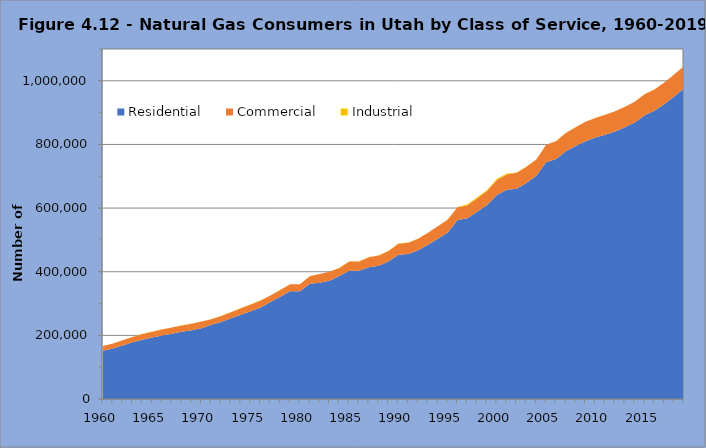
| Category | Residential | Commercial | Industrial |
|---|---|---|---|
| 1960.0 | 151700 | 14500 | 300 |
| 1961.0 | 159000 | 15200 | 400 |
| 1962.0 | 168400 | 16100 | 400 |
| 1963.0 | 178100 | 17000 | 400 |
| 1964.0 | 186600 | 17800 | 400 |
| 1965.0 | 193000 | 18400 | 500 |
| 1966.0 | 199400 | 18900 | 600 |
| 1967.0 | 205000 | 19500 | 600 |
| 1968.0 | 211100 | 20100 | 600 |
| 1969.0 | 216100 | 20600 | 600 |
| 1970.0 | 222000 | 21200 | 600 |
| 1971.0 | 233100 | 17900 | 700 |
| 1972.0 | 242100 | 18600 | 700 |
| 1973.0 | 253400 | 19500 | 700 |
| 1974.0 | 264800 | 20300 | 700 |
| 1975.0 | 275600 | 21200 | 700 |
| 1976.0 | 287200 | 22100 | 700 |
| 1977.0 | 304900 | 20000 | 700 |
| 1978.0 | 321300 | 21000 | 700 |
| 1979.0 | 338300 | 22100 | 600 |
| 1980.0 | 338300 | 22100 | 600 |
| 1981.0 | 362300 | 23600 | 600 |
| 1982.0 | 365600 | 27000 | 500 |
| 1983.0 | 371700 | 28100 | 500 |
| 1984.0 | 386500 | 25200 | 500 |
| 1985.0 | 403300 | 29000 | 600 |
| 1986.0 | 403200 | 29000 | 600 |
| 1987.0 | 414020 | 31329 | 551 |
| 1988.0 | 418569 | 32637 | 627 |
| 1989.0 | 432377 | 32966 | 550 |
| 1990.0 | 453023 | 34697 | 1508 |
| 1991.0 | 455649 | 35627 | 631 |
| 1992.0 | 467664 | 36145 | 783 |
| 1993.0 | 484438 | 37816 | 345 |
| 1994.0 | 503583 | 39183 | 252 |
| 1995.0 | 523622 | 40101 | 713 |
| 1996.0 | 562343 | 40107 | 923 |
| 1997.0 | 567786 | 40689 | 3379 |
| 1998.0 | 588364 | 42054 | 3597 |
| 1999.0 | 609603 | 43861 | 3625 |
| 2000.0 | 641111 | 47201 | 3576 |
| 2001.0 | 657728 | 47477 | 3535 |
| 2002.0 | 660677 | 50202 | 949 |
| 2003.0 | 678833 | 51063 | 924 |
| 2004.0 | 701255 | 51503 | 312 |
| 2005.0 | 743761 | 55174 | 191 |
| 2006.0 | 754554 | 55821 | 274 |
| 2007.0 | 778644 | 57741 | 278 |
| 2008.0 | 794880 | 59502 | 313 |
| 2009.0 | 810442 | 60781 | 293 |
| 2010.0 | 821525 | 61976 | 293 |
| 2011.0 | 830219 | 62885 | 286 |
| 2012.0 | 840687 | 63383 | 302 |
| 2013.0 | 854389 | 64114 | 323 |
| 2014.0 | 869052 | 65134 | 326 |
| 2015.0 | 891917 | 66143 | 320 |
| 2016.0 | 905849 | 66987 | 322 |
| 2017.0 | 926623 | 67926 | 334 |
| 2018.0 | 950644 | 69191 | 350 |
| 2019.0 | 976042 | 70275 | 363 |